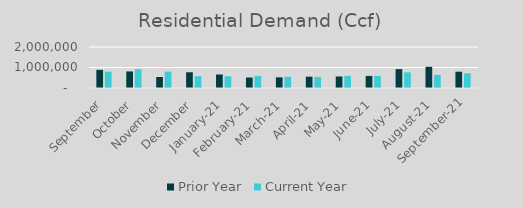
| Category | Prior Year | Current Year |
|---|---|---|
| September | 884745.885 | 795392.365 |
| October | 808030.57 | 913450.318 |
| November | 537591.016 | 796803.85 |
| December | 768795.205 | 575698.992 |
| January-21 | 659359.876 | 574964.407 |
| February-21 | 510296.309 | 591912.627 |
| March-21 | 521598.856 | 545392.69 |
| April-21 | 552550.404 | 533967.423 |
| May-21 | 561680.927 | 591911.753 |
| June-21 | 588815.728 | 587861.265 |
| July-21 | 920418.723 | 764849.567 |
| August-21 | 1034271.241 | 637451.79 |
| September-21 | 795392.365 | 715703.433 |